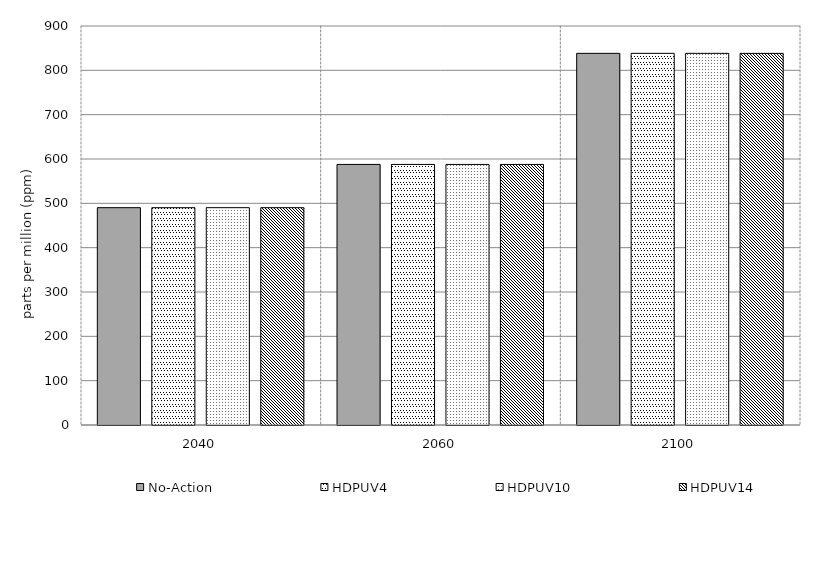
| Category | No-Action | HDPUV4 | HDPUV10 | HDPUV14 | Series 4 | Alt 5 | Alt 6 | Alt 7 | Alt 8 | Alt 10 |
|---|---|---|---|---|---|---|---|---|---|---|
| 2040.0 | 490.191 | 490.191 | 490.19 | 490.188 |  |  |  |  |  |  |
| 2060.0 | 587.756 | 587.756 | 587.753 | 587.74 |  |  |  |  |  |  |
| 2100.0 | 838.312 | 838.312 | 838.301 | 838.27 |  |  |  |  |  |  |